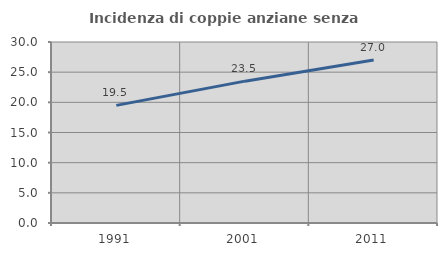
| Category | Incidenza di coppie anziane senza figli  |
|---|---|
| 1991.0 | 19.499 |
| 2001.0 | 23.511 |
| 2011.0 | 27.007 |